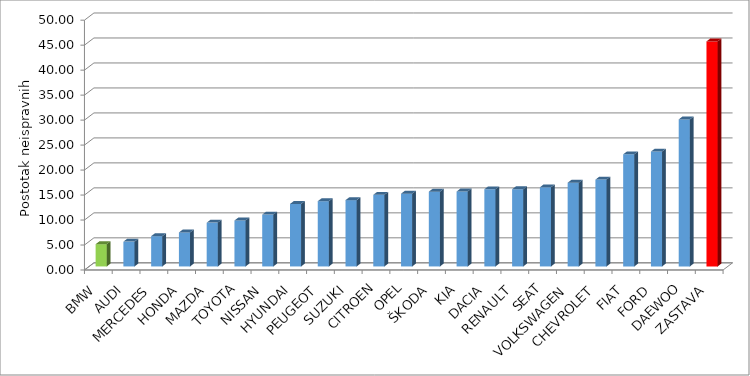
| Category | Series 4 |
|---|---|
| BMW | 4.454 |
| AUDI | 4.967 |
| MERCEDES | 6.061 |
| HONDA | 6.801 |
| MAZDA | 8.772 |
| TOYOTA | 9.195 |
| NISSAN | 10.377 |
| HYUNDAI | 12.507 |
| PEUGEOT | 13.055 |
| SUZUKI | 13.271 |
| CITROEN | 14.336 |
| OPEL | 14.56 |
| ŠKODA | 14.962 |
| KIA | 15.001 |
| DACIA | 15.444 |
| RENAULT | 15.45 |
| SEAT | 15.847 |
| VOLKSWAGEN | 16.754 |
| CHEVROLET | 17.378 |
| FIAT | 22.442 |
| FORD | 22.993 |
| DAEWOO | 29.433 |
| ZASTAVA | 45.044 |